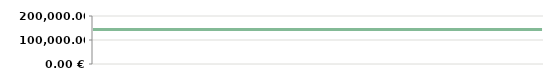
| Category | AASTA   |
|---|---|
| 2013-04-23 | 143800 |
| 2013-04-25 | 143800 |
| 2013-05-07 | 143800 |
| 2013-05-14 | 143800 |
| 2013-05-14 | 143800 |
| 2013-05-29 | 143800 |
| 2013-06-10 | 143800 |
| 2013-06-21 | 143800 |
| 2013-07-06 | 143800 |
| 2013-08-05 | 143800 |
| 2013-08-19 | 143800 |
| 2013-09-04 | 143800 |
| 2013-09-20 | 143800 |
| 2013-09-25 | 143800 |
| 2013-10-15 | 143800 |
| 2013-11-05 | 143800 |
| 2013-11-26 | 143800 |
| 2013-11-30 | 143800 |
| 2013-12-11 | 143800 |